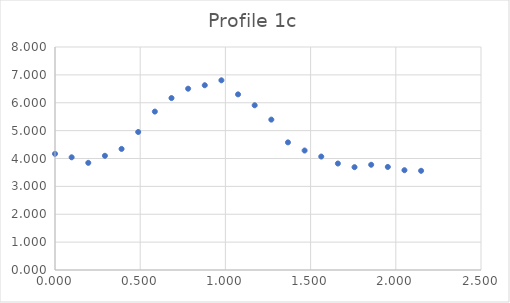
| Category | Series 0 |
|---|---|
| 0.0 | 4.167 |
| 0.09765625 | 4.043 |
| 0.1953125 | 3.844 |
| 0.29296875 | 4.097 |
| 0.390625 | 4.343 |
| 0.48828125 | 4.951 |
| 0.5859375 | 5.683 |
| 0.68359375 | 6.168 |
| 0.78125 | 6.504 |
| 0.87890625 | 6.628 |
| 0.9765625 | 6.805 |
| 1.07421875 | 6.301 |
| 1.171875 | 5.909 |
| 1.26953125 | 5.395 |
| 1.3671875 | 4.579 |
| 1.46484375 | 4.286 |
| 1.5625 | 4.07 |
| 1.66015625 | 3.82 |
| 1.7578125 | 3.689 |
| 1.85546875 | 3.775 |
| 1.953125 | 3.697 |
| 2.05078125 | 3.58 |
| 2.1484375 | 3.559 |